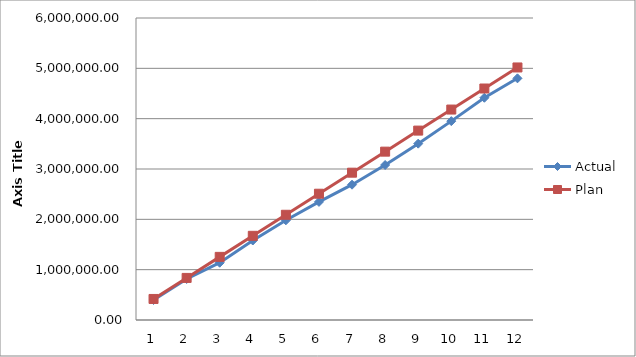
| Category | Actual | Plan |
|---|---|---|
| 0 | 397403.33 | 418108.333 |
| 1 | 815147.63 | 836216.667 |
| 2 | 1138006.64 | 1254325 |
| 3 | 1579321.87 | 1672433.333 |
| 4 | 1980606.95 | 2090541.667 |
| 5 | 2346235.83 | 2508650 |
| 6 | 2688242.83 | 2926758.333 |
| 7 | 3079253.85 | 3344866.667 |
| 8 | 3503656.35 | 3762975 |
| 9 | 3950968.24 | 4181083.333 |
| 10 | 4415474.91 | 4599191.667 |
| 11 | 4801408.19 | 5017300 |